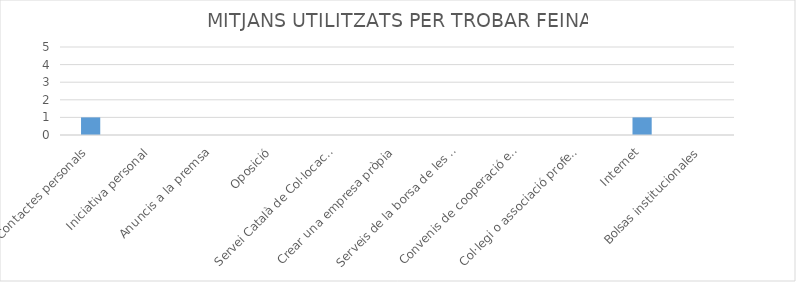
| Category | Series 0 |
|---|---|
| Contactes personals | 1 |
| Iniciativa personal | 0 |
| Anuncis a la premsa | 0 |
| Oposició | 0 |
| Servei Català de Col·locació | 0 |
| Crear una empresa pròpia | 0 |
| Serveis de la borsa de les universitats | 0 |
| Convenis de cooperació educativa | 0 |
| Col·legi o associació professional | 0 |
| Internet | 1 |
| Bolsas institucionales | 0 |